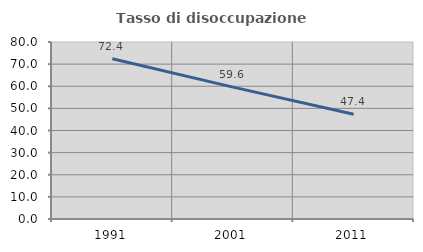
| Category | Tasso di disoccupazione giovanile  |
|---|---|
| 1991.0 | 72.449 |
| 2001.0 | 59.596 |
| 2011.0 | 47.368 |